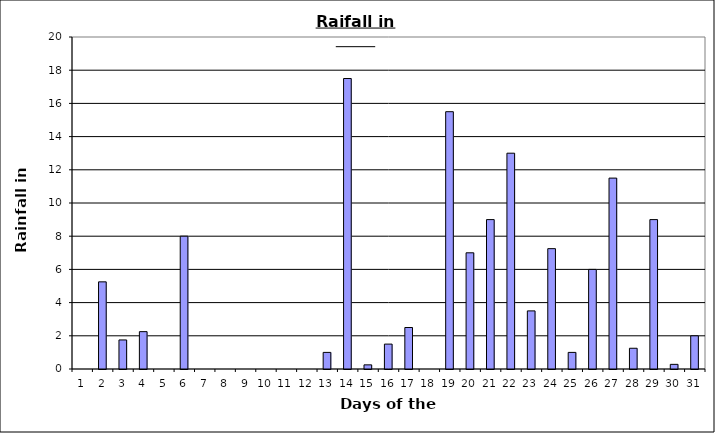
| Category | Series 0 |
|---|---|
| 0 | 0 |
| 1 | 5.25 |
| 2 | 1.75 |
| 3 | 2.25 |
| 4 | 0 |
| 5 | 8 |
| 6 | 0 |
| 7 | 0 |
| 8 | 0 |
| 9 | 0 |
| 10 | 0 |
| 11 | 0 |
| 12 | 1 |
| 13 | 17.5 |
| 14 | 0.25 |
| 15 | 1.5 |
| 16 | 2.5 |
| 17 | 0 |
| 18 | 15.5 |
| 19 | 7 |
| 20 | 9 |
| 21 | 13 |
| 22 | 3.5 |
| 23 | 7.25 |
| 24 | 1 |
| 25 | 6 |
| 26 | 11.5 |
| 27 | 1.25 |
| 28 | 9 |
| 29 | 0.28 |
| 30 | 2 |